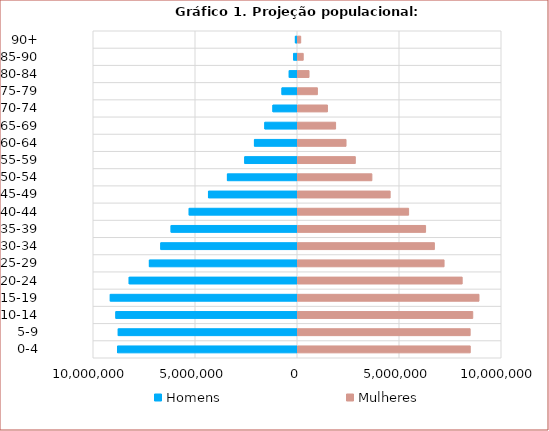
| Category | Homens  | Mulheres |
|---|---|---|
| 0-4 | -8822519 | 8491991 |
| 5-9 | -8786527 | 8487231 |
| 10-14 | -8903808 | 8614988 |
| 15-19 | -9176873 | 8920682 |
| 20-24 | -8250696 | 8096049 |
| 25-29 | -7260478 | 7208187 |
| 30-34 | -6701791 | 6734234 |
| 35-39 | -6195776 | 6302187 |
| 40-44 | -5308879 | 5470281 |
| 45-49 | -4363521 | 4565238 |
| 50-54 | -3434991 | 3670106 |
| 55-59 | -2587248 | 2858334 |
| 60-64 | -2110503 | 2403019 |
| 65-69 | -1602216 | 1891445 |
| 70-74 | -1205425 | 1491525 |
| 75-79 | -760107 | 999025 |
| 80-84 | -404998 | 589069 |
| 85-90 | -189758 | 304174 |
| 90+ | -103543 | 180924 |